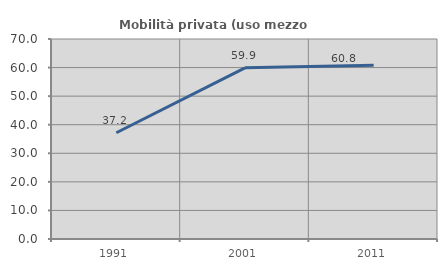
| Category | Mobilità privata (uso mezzo privato) |
|---|---|
| 1991.0 | 37.198 |
| 2001.0 | 59.916 |
| 2011.0 | 60.776 |